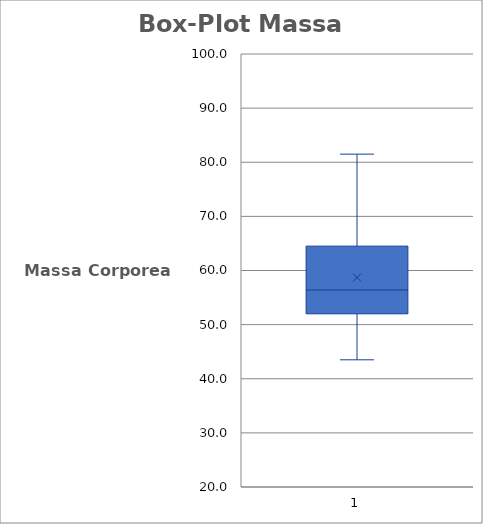
| Category | MEDIA | Media+3*Sigma | Media-3*Sigma |
|---|---|---|---|
| 1.0 | 1.667 | 1.918 | 1.417 |
| 2.0 | 1.667 | 1.918 | 1.417 |
| 3.0 | 1.667 | 1.918 | 1.417 |
| 4.0 | 1.667 | 1.918 | 1.417 |
| 5.0 | 1.667 | 1.918 | 1.417 |
| 6.0 | 1.667 | 1.918 | 1.417 |
| 7.0 | 1.667 | 1.918 | 1.417 |
| 8.0 | 1.667 | 1.918 | 1.417 |
| 9.0 | 1.667 | 1.918 | 1.417 |
| 10.0 | 1.667 | 1.918 | 1.417 |
| 11.0 | 1.667 | 1.918 | 1.417 |
| 12.0 | 1.667 | 1.918 | 1.417 |
| 13.0 | 1.667 | 1.918 | 1.417 |
| 14.0 | 1.667 | 1.918 | 1.417 |
| 15.0 | 1.667 | 1.918 | 1.417 |
| 16.0 | 1.667 | 1.918 | 1.417 |
| 17.0 | 1.667 | 1.918 | 1.417 |
| 18.0 | 1.667 | 1.918 | 1.417 |
| 19.0 | 1.667 | 1.918 | 1.417 |
| 20.0 | 1.667 | 1.918 | 1.417 |
| 21.0 | 1.667 | 1.918 | 1.417 |
| 22.0 | 1.667 | 1.918 | 1.417 |
| 23.0 | 1.667 | 1.918 | 1.417 |
| 24.0 | 1.667 | 1.918 | 1.417 |
| 25.0 | 1.667 | 1.918 | 1.417 |
| 26.0 | 1.667 | 1.918 | 1.417 |
| 27.0 | 1.667 | 1.918 | 1.417 |
| 28.0 | 1.667 | 1.918 | 1.417 |
| 29.0 | 1.667 | 1.918 | 1.417 |
| 30.0 | 1.667 | 1.918 | 1.417 |
| 31.0 | 1.667 | 1.918 | 1.417 |
| 32.0 | 1.667 | 1.918 | 1.417 |
| 33.0 | 1.667 | 1.918 | 1.417 |
| 34.0 | 1.667 | 1.918 | 1.417 |
| 35.0 | 1.667 | 1.918 | 1.417 |
| 36.0 | 1.667 | 1.918 | 1.417 |
| 37.0 | 1.667 | 1.918 | 1.417 |
| 38.0 | 1.667 | 1.918 | 1.417 |
| 39.0 | 1.667 | 1.918 | 1.417 |
| 40.0 | 1.667 | 1.918 | 1.417 |
| 41.0 | 1.667 | 1.918 | 1.417 |
| 42.0 | 1.667 | 1.918 | 1.417 |
| 43.0 | 1.667 | 1.918 | 1.417 |
| 44.0 | 1.667 | 1.918 | 1.417 |
| 45.0 | 1.667 | 1.918 | 1.417 |
| 46.0 | 1.667 | 1.918 | 1.417 |
| 47.0 | 1.667 | 1.918 | 1.417 |
| 48.0 | 1.667 | 1.918 | 1.417 |
| 49.0 | 1.667 | 1.918 | 1.417 |
| 50.0 | 1.667 | 1.918 | 1.417 |
| 51.0 | 1.667 | 1.918 | 1.417 |